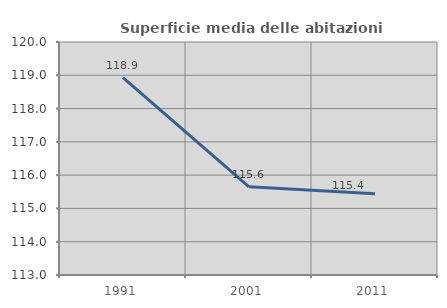
| Category | Superficie media delle abitazioni occupate |
|---|---|
| 1991.0 | 118.928 |
| 2001.0 | 115.65 |
| 2011.0 | 115.445 |